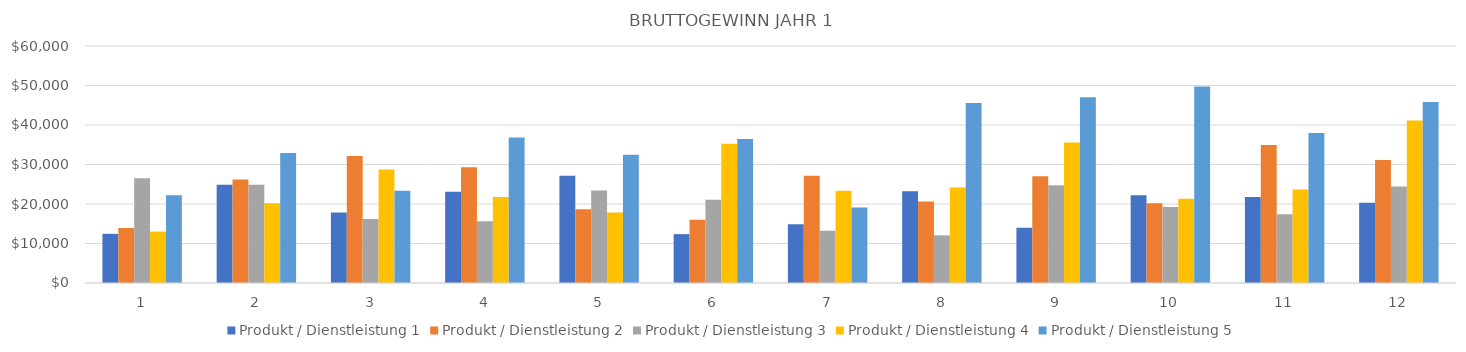
| Category | Produkt / Dienstleistung 1 | Produkt / Dienstleistung 2 | Produkt / Dienstleistung 3 | Produkt / Dienstleistung 4 | Produkt / Dienstleistung 5 |
|---|---|---|---|---|---|
| 0 | 12453 | 13896 | 26541 | 13024 | 22200 |
| 1 | 24899 | 26232 | 24858 | 20218 | 32880 |
| 2 | 17822 | 32152 | 16218 | 28743 | 23385 |
| 3 | 23107.5 | 29287.5 | 15623 | 21766.5 | 36815.5 |
| 4 | 27131 | 18660 | 23400.5 | 17871 | 32465.5 |
| 5 | 12369.5 | 15982.5 | 21063 | 35238 | 36438.5 |
| 6 | 14891.5 | 27142.5 | 13200.5 | 23331 | 19140 |
| 7 | 23211.5 | 20602.5 | 12061.5 | 24202.5 | 45559 |
| 8 | 14007.5 | 27052.5 | 24726.5 | 35595 | 47052.5 |
| 9 | 22218 | 20160 | 19233 | 21329 | 49770 |
| 10 | 21780 | 34920 | 17376 | 23647 | 38000 |
| 11 | 20340 | 31170 | 24420 | 41158 | 45840 |